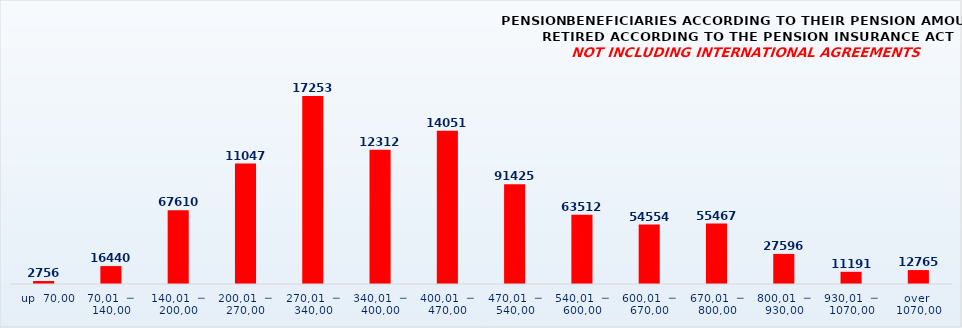
| Category | PENSION BENEFICIARIES ACCORDING TO TYPES AND AMOUNTS OF PENSION, RETIRED ACCORDING TO THE PENSION INSURANCE ACT
NOT INCLUDING INTERNATIONAL AGREEMENTS |
|---|---|
|   up  70,00 | 2756 |
| 70,01  ─  140,00 | 16440 |
| 140,01  ─  200,00 | 67610 |
| 200,01  ─  270,00 | 110477 |
| 270,01  ─  340,00 | 172536 |
| 340,01  ─  400,00 | 123120 |
| 400,01  ─  470,00 | 140516 |
| 470,01  ─  540,00 | 91425 |
| 540,01  ─  600,00 | 63512 |
| 600,01  ─  670,00 | 54554 |
| 670,01  ─  800,00 | 55467 |
| 800,01  ─  930,00 | 27596 |
| 930,01  ─  1070,00 | 11191 |
| over  1070,00 | 12765 |